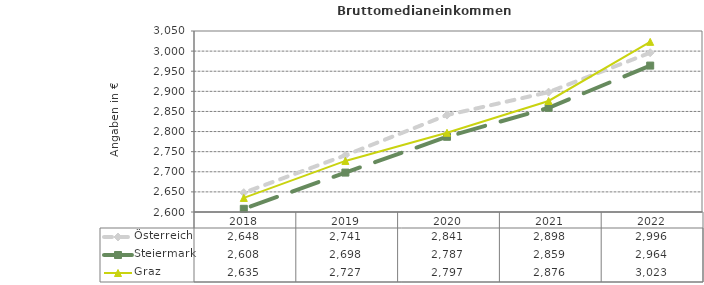
| Category | Österreich | Steiermark | Graz |
|---|---|---|---|
| 2022.0 | 2996 | 2964 | 3023 |
| 2021.0 | 2898 | 2859 | 2876 |
| 2020.0 | 2841 | 2787 | 2797 |
| 2019.0 | 2741 | 2698 | 2727 |
| 2018.0 | 2648 | 2608 | 2635 |